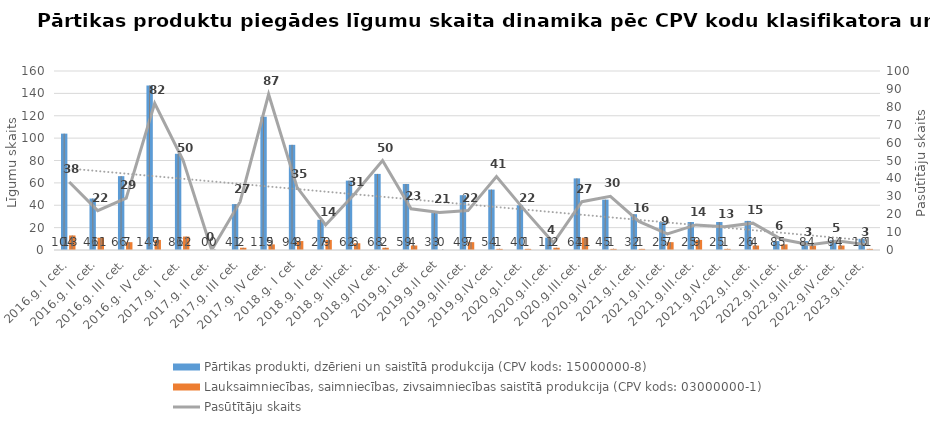
| Category | Pārtikas produkti, dzērieni un saistītā produkcija (CPV kods: 15000000-8) | Lauksaimniecības, saimniecības, zivsaimniecības saistītā produkcija (CPV kods: 03000000-1) |
|---|---|---|
| 2016.g. I cet. | 104 | 13 |
| 2016.g. II cet. | 46 | 11 |
| 2016.g. III cet. | 66 | 7 |
| 2016.g. IV cet. | 147 | 9 |
| 2017.g. I cet. | 86 | 12 |
| 2017.g. II cet. | 0 | 0 |
| 2017.g. III cet. | 41 | 2 |
| 2017.g. IV cet. | 119 | 5 |
| 2018.g. I cet | 94 | 8 |
| 2018.g. II cet. | 27 | 9 |
| 2018.g. IIIcet. | 62 | 6 |
| 2018.g.IV cet. | 68 | 2 |
| 2019.g.I cet | 59 | 4 |
| 2019.g.II cet | 33 | 0 |
| 2019.g.III.cet. | 49 | 7 |
| 2019.g.IV.cet. | 54 | 1 |
| 2020.g.I.cet. | 40 | 1 |
| 2020.g.II.cet. | 11 | 2 |
| 2020.g.III.cet. | 64 | 11 |
| 2020.g.IV.cet. | 45 | 1 |
| 2021.g.I.cet. | 32 | 1 |
| 2021.g.II.cet. | 25 | 7 |
| 2021.g.III.cet. | 25 | 9 |
| 2021.g.IV.cet. | 25 | 1 |
| 2022.g.I.cet. | 26 | 4 |
| 2022.g.II.cet. | 8 | 5 |
| 2022.g.III.cet. | 8 | 4 |
| 2022.g.IV.cet. | 9 | 4 |
| 2023.g.I.cet. | 10 | 1 |